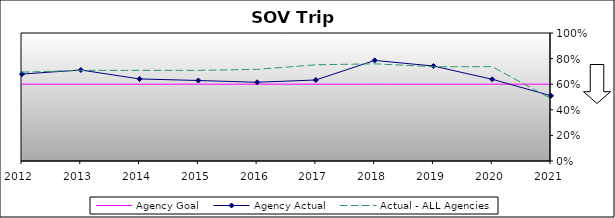
| Category | Agency Goal | Agency Actual | Actual - ALL Agencies |
|---|---|---|---|
| 2012.0 | 0.6 | 0.679 | 0.694 |
| 2013.0 | 0.6 | 0.711 | 0.708 |
| 2014.0 | 0.6 | 0.641 | 0.708 |
| 2015.0 | 0.6 | 0.629 | 0.708 |
| 2016.0 | 0.6 | 0.615 | 0.716 |
| 2017.0 | 0.6 | 0.633 | 0.752 |
| 2018.0 | 0.6 | 0.786 | 0.759 |
| 2019.0 | 0.6 | 0.742 | 0.736 |
| 2020.0 | 0.6 | 0.638 | 0.737 |
| 2021.0 | 0.6 | 0.51 | 0.487 |